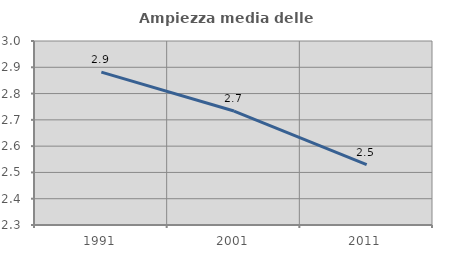
| Category | Ampiezza media delle famiglie |
|---|---|
| 1991.0 | 2.881 |
| 2001.0 | 2.734 |
| 2011.0 | 2.53 |